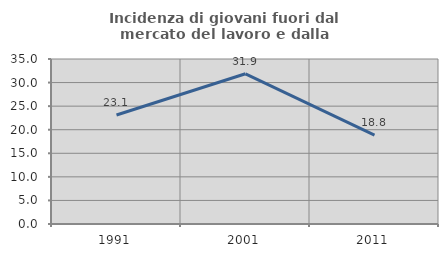
| Category | Incidenza di giovani fuori dal mercato del lavoro e dalla formazione  |
|---|---|
| 1991.0 | 23.114 |
| 2001.0 | 31.864 |
| 2011.0 | 18.831 |